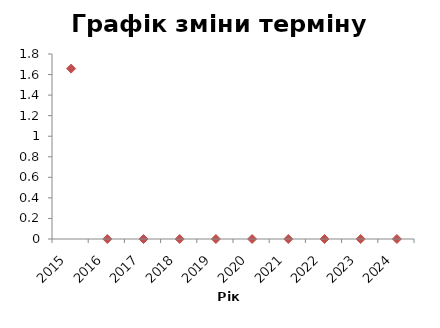
| Category | Series 0 |
|---|---|
| 2015.0 | 1.658 |
| 2016.0 | 0 |
| 2017.0 | 0 |
| 2018.0 | 0 |
| 2019.0 | 0 |
| 2020.0 | 0 |
| 2021.0 | 0 |
| 2022.0 | 0 |
| 2023.0 | 0 |
| 2024.0 | 0 |